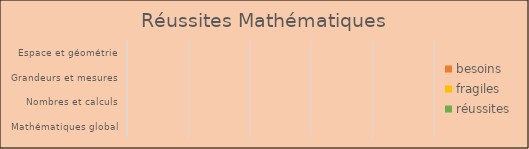
| Category | besoins | fragiles | réussites |
|---|---|---|---|
| Mathématiques global | 0 | 0 | 0 |
| Nombres et calculs | 0 | 0 | 0 |
| Grandeurs et mesures | 0 | 0 | 0 |
| Espace et géométrie | 0 | 0 | 0 |